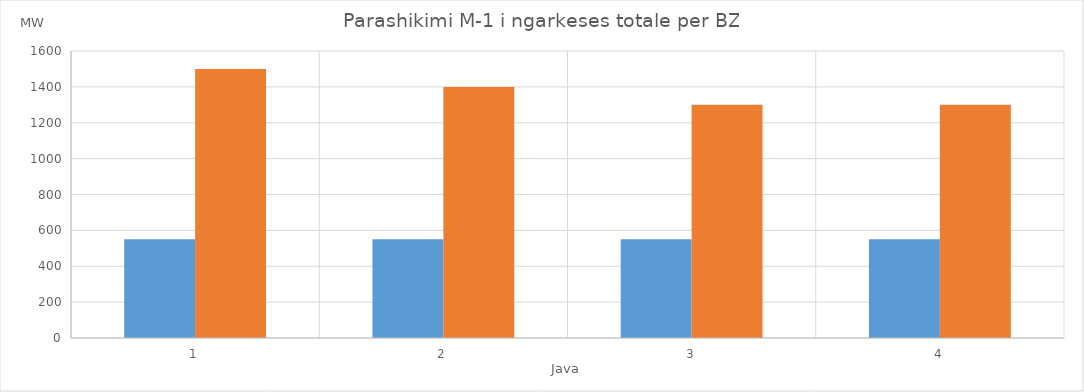
| Category | Min (MW) | Max (MW) |
|---|---|---|
| 0 | 550 | 1500 |
| 1 | 550 | 1400 |
| 2 | 550 | 1300 |
| 3 | 550 | 1300 |